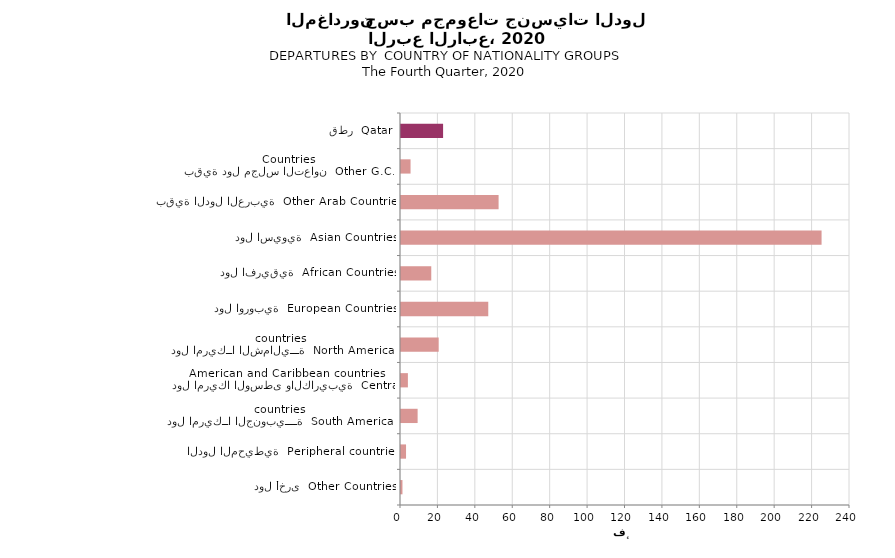
| Category | Series 0 |
|---|---|
| دول أخرى  Other Countries | 778 |
| الدول المحيطية  Peripheral countries | 2693 |
| دول امريكــا الجنوبيــــة  South American countries | 8885 |
| دول امريكا الوسطى والكاريبية  Central American and Caribbean countries | 3688 |
| دول امريكــا الشماليـــة  North American countries  | 20146 |
| دول اوروبية  European Countries | 46644 |
| دول افريقية  African Countries | 16177 |
| دول اسيوية  Asian Countries | 224805 |
| بقية الدول العربية  Other Arab Countries | 52167 |
| بقية دول مجلس التعاون  Other G.C.C Countries | 5104 |
| قطر  Qatar | 22499 |